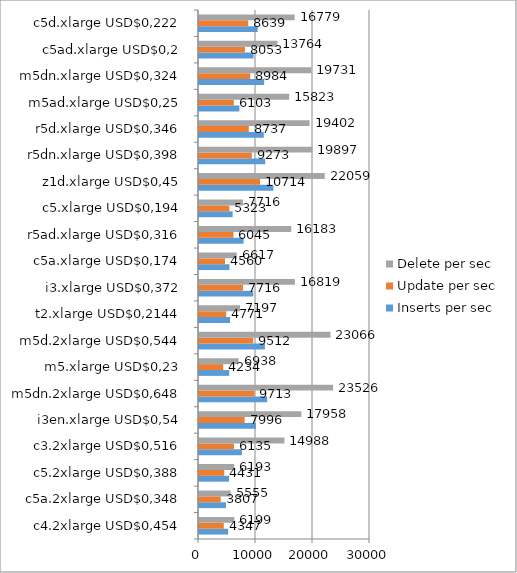
| Category | Inserts per sec | Update per sec | Delete per sec |
|---|---|---|---|
| c4.2xlarge USD$0,454 | 5122.242 | 4346.579 | 6198.936 |
| c5a.2xlarge USD$0,348 | 4739.269 | 3807.45 | 5554.661 |
| c5.2xlarge USD$0,388 | 5260.887 | 4431.033 | 6192.909 |
| c3.2xlarge USD$0,516 | 7537.442 | 6134.631 | 14988.234 |
| i3en.xlarge USD$0,54 | 9995.102 | 7995.714 | 17957.513 |
| m5dn.2xlarge USD$0,648 | 11959.005 | 9713.359 | 23525.537 |
| m5.xlarge USD$0,23 | 5305.603 | 4234.399 | 6937.507 |
| m5d.2xlarge USD$0,544 | 11571.396 | 9512.485 | 23066.454 |
| t2.xlarge USD$0,2144 | 5447.691 | 4771.266 | 7197.3 |
| i3.xlarge USD$0,372 | 9526.35 | 7715.633 | 16818.878 |
| c5a.xlarge USD$0,174 | 5340.026 | 4559.984 | 6617.345 |
| r5ad.xlarge USD$0,316 | 7817.386 | 6044.889 | 16182.801 |
| c5.xlarge USD$0,194 | 5896.296 | 5323.113 | 7716.228 |
| z1d.xlarge USD$0,45 | 13060.116 | 10714.324 | 22059.472 |
| r5dn.xlarge USD$0,398 | 11622.231 | 9272.739 | 19896.538 |
| r5d.xlarge USD$0,346 | 11366.349 | 8736.829 | 19402.029 |
| m5ad.xlarge USD$0,25 | 7081.05 | 6103.218 | 15823.035 |
| m5dn.xlarge USD$0,324 | 11428.963 | 8983.515 | 19730.871 |
| c5ad.xlarge USD$0,2 | 9572.951 | 8052.891 | 13764.435 |
| c5d.xlarge USD$0,222 | 10291.03 | 8638.712 | 16779.087 |